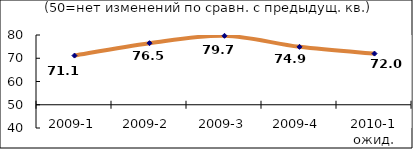
| Category | Диф.индекс ↓ |
|---|---|
| 2009-1 | 71.145 |
| 2009-2 | 76.485 |
| 2009-3 | 79.66 |
| 2009-4 | 74.905 |
| 2010-1 ожид. | 72.005 |